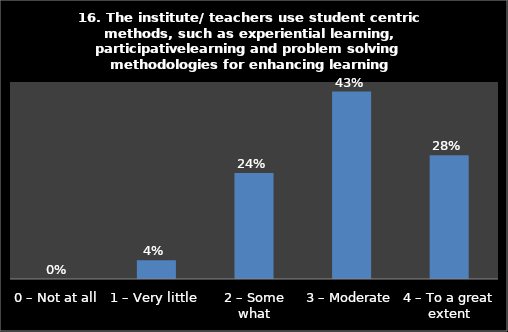
| Category | Series 0 |
|---|---|
| 0 – Not at all | 0 |
| 1 – Very little | 0.043 |
| 2 – Some what | 0.242 |
| 3 – Moderate | 0.428 |
| 4 – To a great extent | 0.283 |